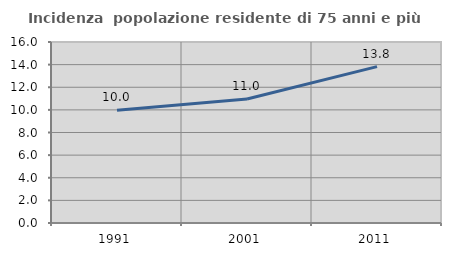
| Category | Incidenza  popolazione residente di 75 anni e più |
|---|---|
| 1991.0 | 9.962 |
| 2001.0 | 10.956 |
| 2011.0 | 13.824 |